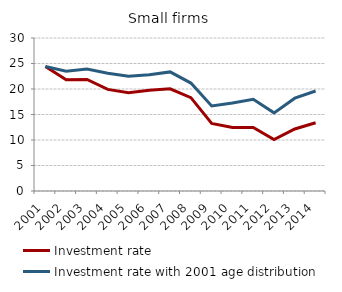
| Category | Investment rate | Investment rate with 2001 age distribution |
|---|---|---|
| 2001.0 | 24.42 | 24.42 |
| 2002.0 | 21.802 | 23.503 |
| 2003.0 | 21.861 | 23.922 |
| 2004.0 | 19.922 | 23.091 |
| 2005.0 | 19.276 | 22.48 |
| 2006.0 | 19.772 | 22.777 |
| 2007.0 | 20.024 | 23.348 |
| 2008.0 | 18.305 | 21.164 |
| 2009.0 | 13.25 | 16.666 |
| 2010.0 | 12.447 | 17.258 |
| 2011.0 | 12.455 | 17.993 |
| 2012.0 | 10.103 | 15.322 |
| 2013.0 | 12.162 | 18.197 |
| 2014.0 | 13.38 | 19.601 |